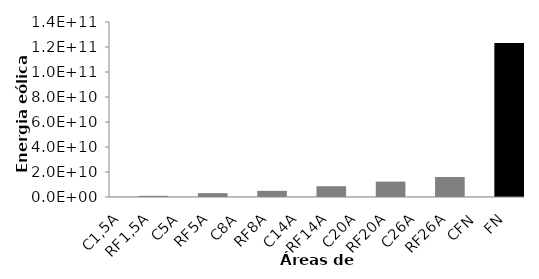
| Category | Series 0 |
|---|---|
| C1,5A | 615881000.865 |
| RF1,5A | 923821501.298 |
| C5A | 615881000.865 |
| RF5A | 3079405004.325 |
| C8A | 615881000.865 |
| RF8A | 4927048006.92 |
| C14A | 615881000.865 |
| RF14A | 8622334012.11 |
| C20A | 615881000.865 |
| RF20A | 12317620017.3 |
| C26A | 615881000.865 |
| RF26A | 16012906022.49 |
| CFN | 615881000.865 |
| FN | 123176200173 |